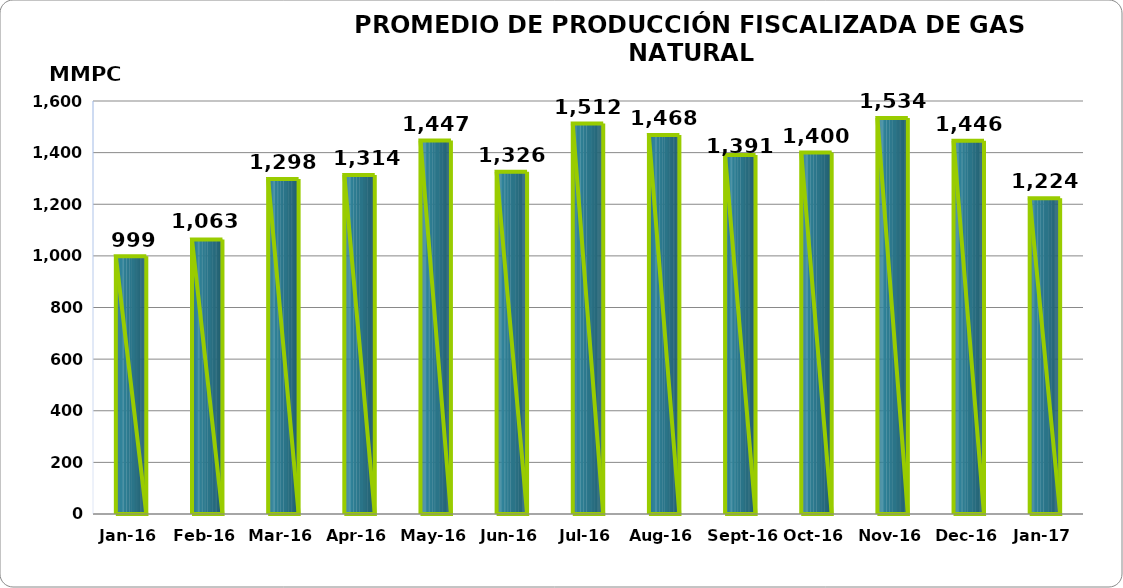
| Category | Series 0 |
|---|---|
| 2016-01-01 | 998675.323 |
| 2016-02-01 | 1063225.969 |
| 2016-03-01 | 1297819.673 |
| 2016-04-01 | 1313613.867 |
| 2016-05-01 | 1446528.161 |
| 2016-06-01 | 1326088.967 |
| 2016-07-01 | 1512372 |
| 2016-08-01 | 1468104.525 |
| 2016-09-01 | 1391000.053 |
| 2016-10-01 | 1400096.432 |
| 2016-11-01 | 1534268.686 |
| 2016-12-01 | 1445701.779 |
| 2017-01-01 | 1223514.523 |